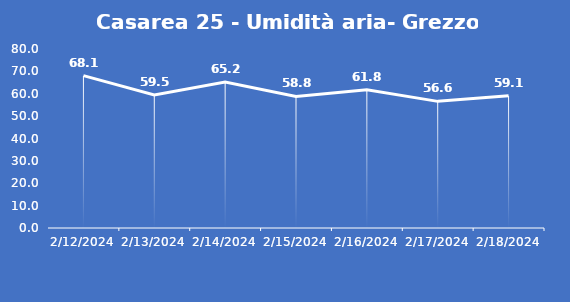
| Category | Casarea 25 - Umidità aria- Grezzo (%) |
|---|---|
| 2/12/24 | 68.1 |
| 2/13/24 | 59.5 |
| 2/14/24 | 65.2 |
| 2/15/24 | 58.8 |
| 2/16/24 | 61.8 |
| 2/17/24 | 56.6 |
| 2/18/24 | 59.1 |